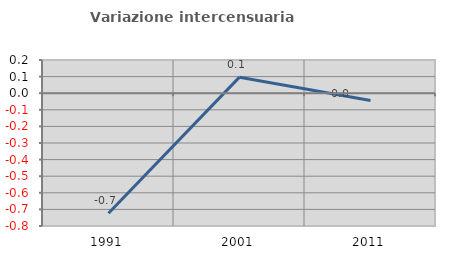
| Category | Variazione intercensuaria annua |
|---|---|
| 1991.0 | -0.724 |
| 2001.0 | 0.097 |
| 2011.0 | -0.044 |